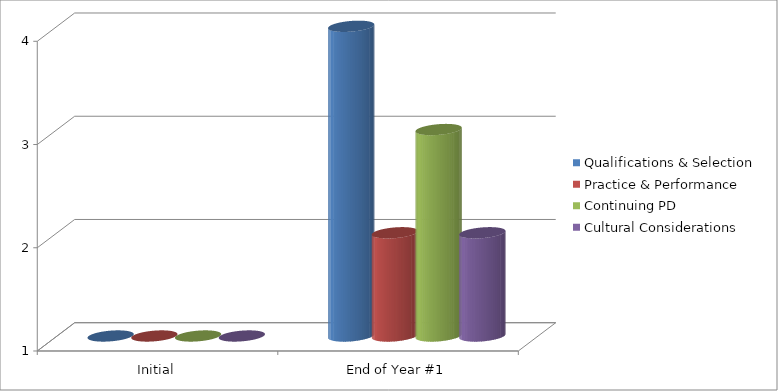
| Category | Qualifications & Selection  | Practice & Performance  | Continuing PD | Cultural Considerations  |
|---|---|---|---|---|
| Initial | 1 | 1 | 1 | 1 |
| End of Year #1 | 4 | 2 | 3 | 2 |